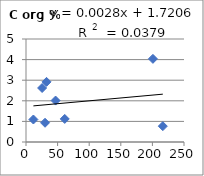
| Category | C org % |
|---|---|
| 25.5 | 2.622 |
| 61.3 | 1.12 |
| 11.7 | 1.092 |
| 216.5 | 0.769 |
| 46.8 | 2.011 |
| 32.5 | 2.919 |
| 200.8 | 4.036 |
| 30.1 | 0.934 |